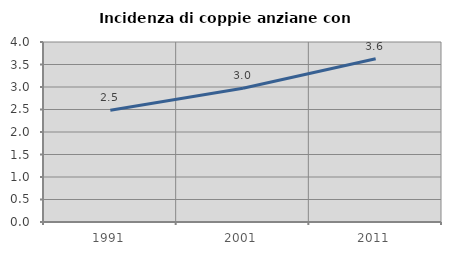
| Category | Incidenza di coppie anziane con figli |
|---|---|
| 1991.0 | 2.483 |
| 2001.0 | 2.97 |
| 2011.0 | 3.628 |